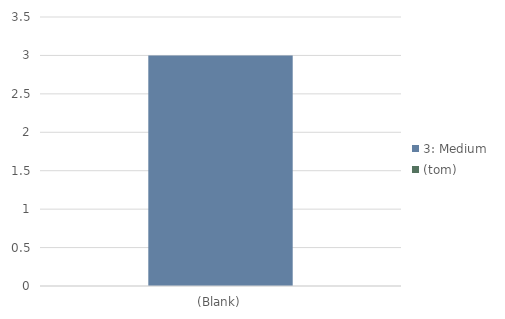
| Category | (tom) | 3: Medium |
|---|---|---|
| (tom) |  | 3 |